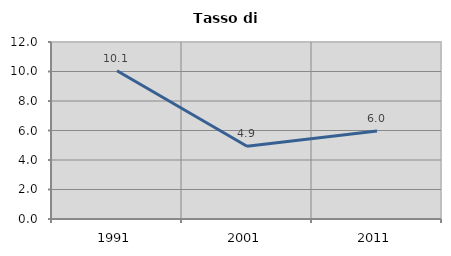
| Category | Tasso di disoccupazione   |
|---|---|
| 1991.0 | 10.051 |
| 2001.0 | 4.928 |
| 2011.0 | 5.973 |